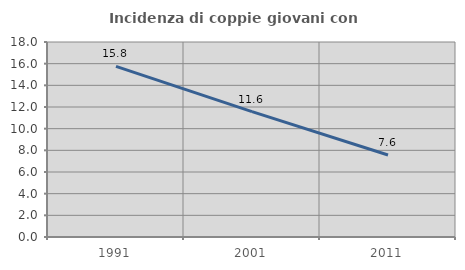
| Category | Incidenza di coppie giovani con figli |
|---|---|
| 1991.0 | 15.751 |
| 2001.0 | 11.577 |
| 2011.0 | 7.572 |